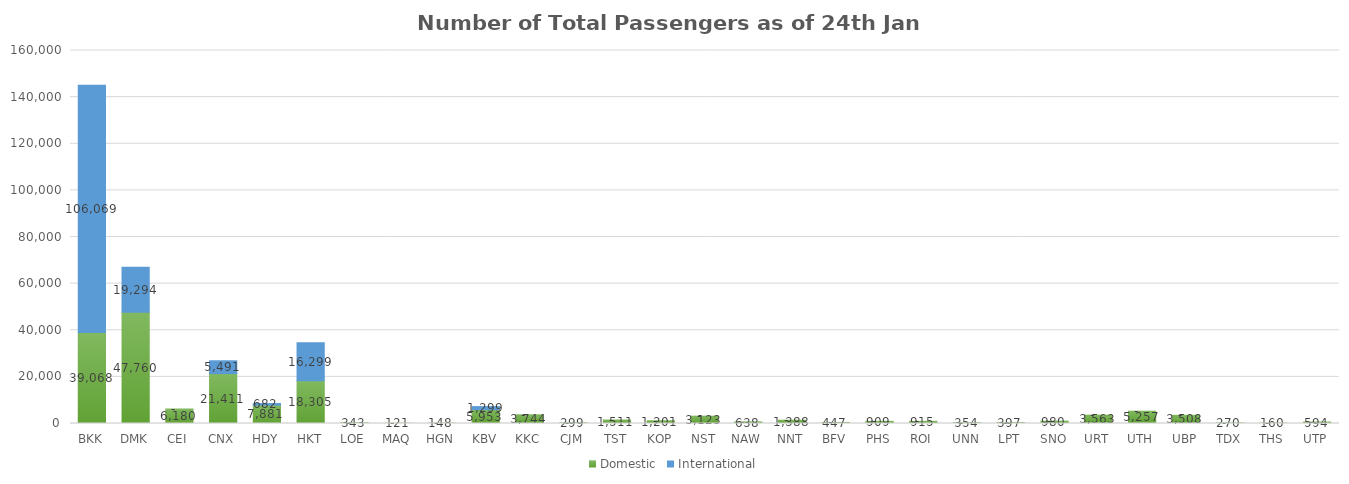
| Category | Domestic | International |
|---|---|---|
| BKK | 39068 | 106069 |
| DMK | 47760 | 19294 |
| CEI | 6180 | 0 |
| CNX | 21411 | 5491 |
| HDY | 7881 | 682 |
| HKT | 18305 | 16299 |
| LOE | 343 | 0 |
| MAQ | 121 | 0 |
| HGN | 148 | 0 |
| KBV | 5953 | 1299 |
| KKC | 3744 | 0 |
| CJM | 299 | 0 |
| TST | 1511 | 0 |
| KOP | 1201 | 0 |
| NST | 3123 | 0 |
| NAW | 638 | 0 |
| NNT | 1388 | 0 |
| BFV | 447 | 0 |
| PHS | 909 | 0 |
| ROI | 915 | 0 |
| UNN | 354 | 0 |
| LPT | 397 | 0 |
| SNO | 980 | 0 |
| URT | 3563 | 0 |
| UTH | 5257 | 0 |
| UBP | 3508 | 0 |
| TDX | 270 | 0 |
| THS | 160 | 0 |
| UTP | 594 | 0 |